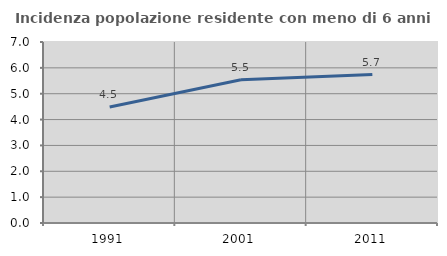
| Category | Incidenza popolazione residente con meno di 6 anni |
|---|---|
| 1991.0 | 4.489 |
| 2001.0 | 5.541 |
| 2011.0 | 5.74 |